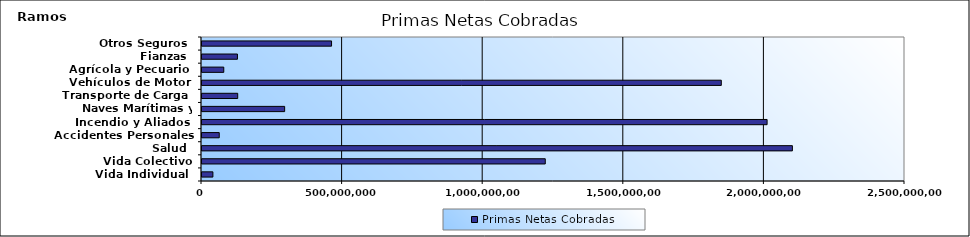
| Category | Primas Netas Cobradas |
|---|---|
| Vida Individual  | 38783818.75 |
| Vida Colectivo | 1220738658.37 |
| Salud  | 2099575187.36 |
| Accidentes Personales | 61303586.75 |
| Incendio y Aliados  | 2009622912.61 |
| Naves Marítimas y Aéreas  | 293933631.82 |
| Transporte de Carga  | 126982975.55 |
| Vehículos de Motor  | 1846766015.66 |
| Agrícola y Pecuario  | 77419769.67 |
| Fianzas  | 126064942.18 |
| Otros Seguros  | 460734130.12 |